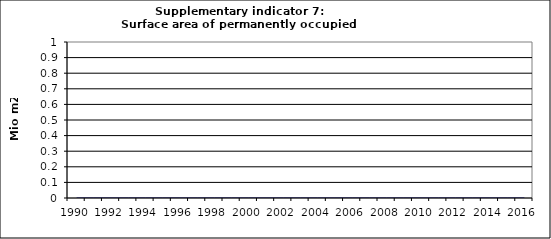
| Category | Surface area of permanently occupied dwellings, Mio m2  |
|---|---|
| 1990 | 0 |
| 1991 | 0 |
| 1992 | 0 |
| 1993 | 0 |
| 1994 | 0 |
| 1995 | 0 |
| 1996 | 0 |
| 1997 | 0 |
| 1998 | 0 |
| 1999 | 0 |
| 2000 | 0 |
| 2001 | 0 |
| 2002 | 0 |
| 2003 | 0 |
| 2004 | 0 |
| 2005 | 0 |
| 2006 | 0 |
| 2007 | 0 |
| 2008 | 0 |
| 2009 | 0 |
| 2010 | 0 |
| 2011 | 0 |
| 2012 | 0 |
| 2013 | 0 |
| 2014 | 0 |
| 2015 | 0 |
| 2016 | 0 |